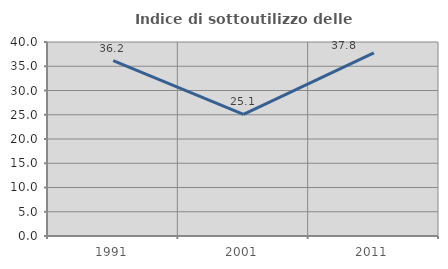
| Category | Indice di sottoutilizzo delle abitazioni  |
|---|---|
| 1991.0 | 36.154 |
| 2001.0 | 25.064 |
| 2011.0 | 37.766 |